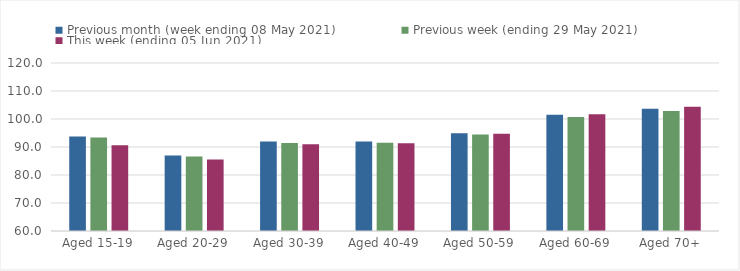
| Category | Previous month (week ending 08 May 2021) | Previous week (ending 29 May 2021) | This week (ending 05 Jun 2021) |
|---|---|---|---|
| Aged 15-19 | 93.79 | 93.36 | 90.63 |
| Aged 20-29 | 86.99 | 86.58 | 85.56 |
| Aged 30-39 | 91.97 | 91.44 | 90.94 |
| Aged 40-49 | 91.98 | 91.55 | 91.36 |
| Aged 50-59 | 94.95 | 94.43 | 94.71 |
| Aged 60-69 | 101.52 | 100.67 | 101.69 |
| Aged 70+ | 103.68 | 102.89 | 104.34 |